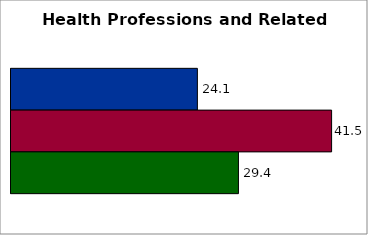
| Category | 50 states and D.C. | SREB states | State |
|---|---|---|---|
| 0 | 24.102 | 41.457 | 29.412 |